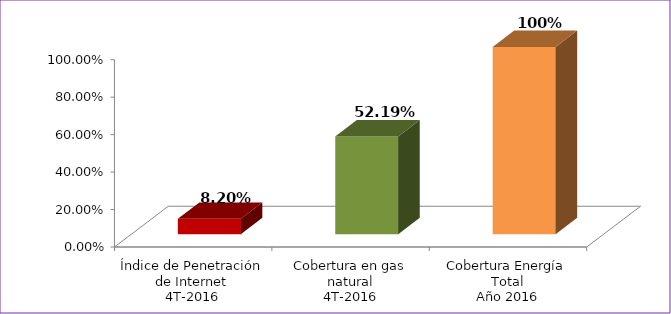
| Category | Series 0 |
|---|---|
| Índice de Penetración de Internet
4T-2016 | 0.082 |
| Cobertura en gas natural
4T-2016 | 0.522 |
| Cobertura Energía Total
Año 2016 | 1 |